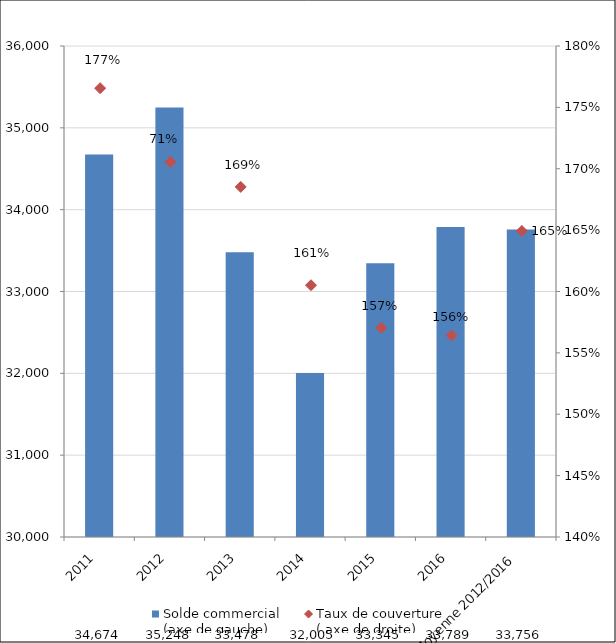
| Category | Solde commercial 
(axe de gauche) |
|---|---|
| 2011 | 34673.736 |
| 2012 | 35248.128 |
| 2013 | 33478.18 |
| 2014 | 32005.154 |
| 2015 | 33344.902 |
| 2016 | 33788.753 |
| Moyenne 2012/2016 | 33756.476 |